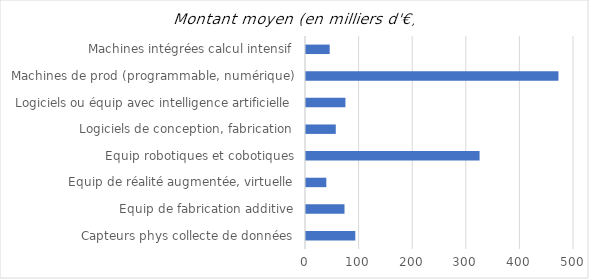
| Category | Series 0 |
|---|---|
| Capteurs phys collecte de données | 91.938 |
| Equip de fabrication additive | 71.822 |
| Equip de réalité augmentée, virtuelle | 37.918 |
| Equip robotiques et cobotiques | 323.842 |
| Logiciels de conception, fabrication | 55.564 |
| Logiciels ou équip avec intelligence artificielle | 73.536 |
| Machines de prod (programmable, numérique) | 471.02 |
| Machines intégrées calcul intensif | 44.171 |